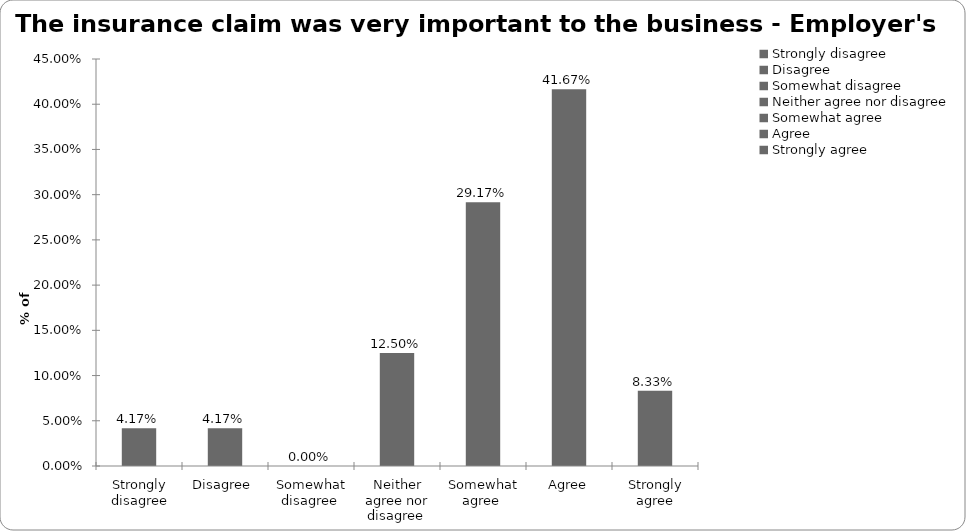
| Category | Employer's liability |
|---|---|
| Strongly disagree | 0.042 |
| Disagree  | 0.042 |
| Somewhat disagree  | 0 |
| Neither agree nor disagree  | 0.125 |
| Somewhat agree  | 0.292 |
| Agree | 0.417 |
| Strongly agree | 0.083 |